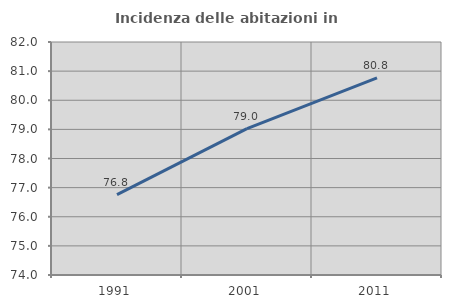
| Category | Incidenza delle abitazioni in proprietà  |
|---|---|
| 1991.0 | 76.759 |
| 2001.0 | 79.024 |
| 2011.0 | 80.767 |